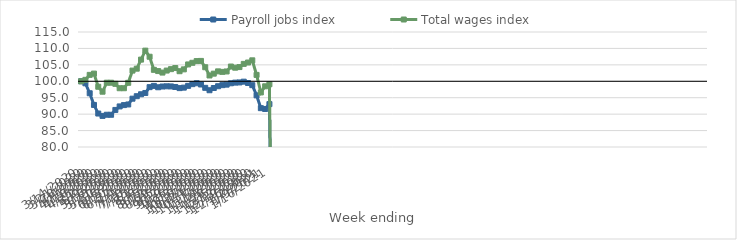
| Category | Payroll jobs index | Total wages index |
|---|---|---|
| 14/03/2020 | 100 | 100 |
| 21/03/2020 | 99.382 | 100.448 |
| 28/03/2020 | 96.356 | 101.955 |
| 04/04/2020 | 92.803 | 102.343 |
| 11/04/2020 | 90.186 | 98.334 |
| 18/04/2020 | 89.465 | 96.833 |
| 25/04/2020 | 89.82 | 99.573 |
| 02/05/2020 | 89.807 | 99.565 |
| 09/05/2020 | 91.282 | 99.218 |
| 16/05/2020 | 92.348 | 97.887 |
| 23/05/2020 | 92.75 | 97.885 |
| 30/05/2020 | 92.948 | 99.534 |
| 06/06/2020 | 94.705 | 103.256 |
| 13/06/2020 | 95.463 | 103.837 |
| 20/06/2020 | 96.052 | 106.594 |
| 27/06/2020 | 96.443 | 109.323 |
| 04/07/2020 | 98.216 | 107.472 |
| 11/07/2020 | 98.597 | 103.486 |
| 18/07/2020 | 98.18 | 103.107 |
| 25/07/2020 | 98.408 | 102.65 |
| 01/08/2020 | 98.473 | 103.264 |
| 08/08/2020 | 98.438 | 103.694 |
| 15/08/2020 | 98.262 | 104.033 |
| 22/08/2020 | 97.919 | 103.066 |
| 29/08/2020 | 98.068 | 103.626 |
| 05/09/2020 | 98.606 | 105.13 |
| 12/09/2020 | 99.127 | 105.63 |
| 19/09/2020 | 99.406 | 106.147 |
| 26/09/2020 | 99.026 | 106.201 |
| 03/10/2020 | 98.005 | 104.276 |
| 10/10/2020 | 97.276 | 101.766 |
| 17/10/2020 | 97.953 | 102.324 |
| 24/10/2020 | 98.498 | 103.02 |
| 31/10/2020 | 98.824 | 102.866 |
| 07/11/2020 | 98.981 | 102.991 |
| 14/11/2020 | 99.394 | 104.489 |
| 21/11/2020 | 99.595 | 104.137 |
| 28/11/2020 | 99.648 | 104.324 |
| 05/12/2020 | 99.883 | 105.295 |
| 12/12/2020 | 99.475 | 105.709 |
| 19/12/2020 | 98.816 | 106.378 |
| 26/12/2020 | 95.72 | 101.945 |
| 02/01/2021 | 91.818 | 96.605 |
| 09/01/2021 | 91.571 | 98.474 |
| 16/01/2021 | 93.051 | 99.09 |